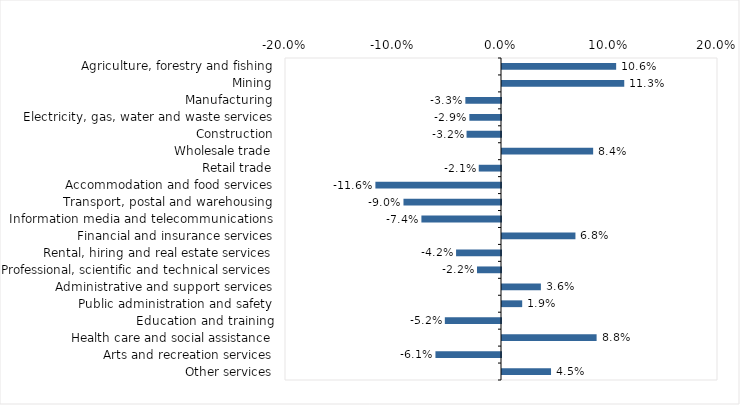
| Category | This week |
|---|---|
| Agriculture, forestry and fishing | 0.106 |
| Mining | 0.113 |
| Manufacturing | -0.033 |
| Electricity, gas, water and waste services | -0.029 |
| Construction | -0.032 |
| Wholesale trade | 0.084 |
| Retail trade | -0.021 |
| Accommodation and food services | -0.116 |
| Transport, postal and warehousing | -0.09 |
| Information media and telecommunications | -0.074 |
| Financial and insurance services | 0.068 |
| Rental, hiring and real estate services | -0.042 |
| Professional, scientific and technical services | -0.022 |
| Administrative and support services | 0.036 |
| Public administration and safety | 0.019 |
| Education and training | -0.052 |
| Health care and social assistance | 0.088 |
| Arts and recreation services | -0.061 |
| Other services | 0.045 |